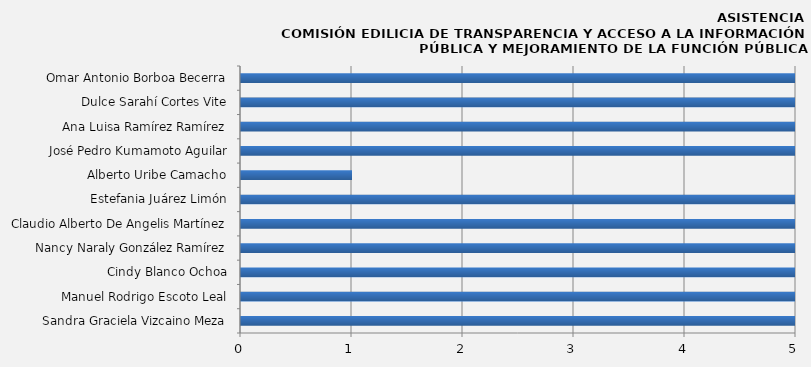
| Category | Sandra Graciela Vizcaino Meza |
|---|---|
| Sandra Graciela Vizcaino Meza | 10 |
| Manuel Rodrigo Escoto Leal | 10 |
| Cindy Blanco Ochoa | 8 |
| Nancy Naraly González Ramírez | 9 |
| Claudio Alberto De Angelis Martínez | 8 |
| Estefania Juárez Limón | 10 |
| Alberto Uribe Camacho | 1 |
| José Pedro Kumamoto Aguilar | 9 |
| Ana Luisa Ramírez Ramírez | 9 |
| Dulce Sarahí Cortes Vite | 8 |
| Omar Antonio Borboa Becerra | 9 |